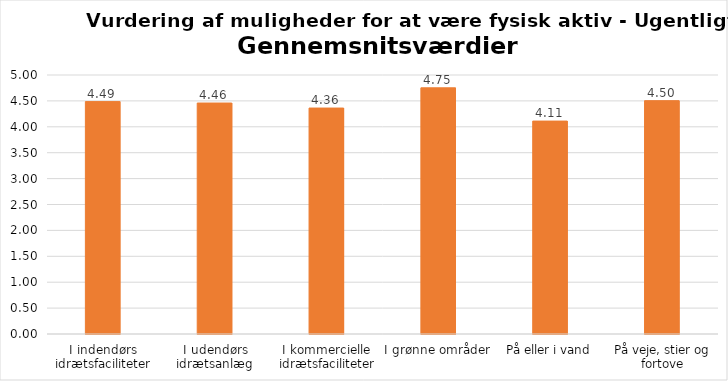
| Category | Gennemsnit |
|---|---|
| I indendørs idrætsfaciliteter | 4.486 |
| I udendørs idrætsanlæg | 4.459 |
| I kommercielle idrætsfaciliteter | 4.362 |
| I grønne områder | 4.753 |
| På eller i vand | 4.11 |
| På veje, stier og fortove | 4.504 |